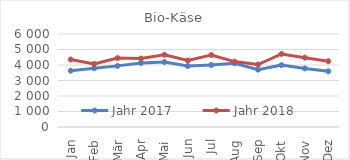
| Category | Jahr 2017 | Jahr 2018 |
|---|---|---|
| Jan | 3630.192 | 4353.001 |
| Feb | 3791.781 | 4066.819 |
| Mär | 3944.033 | 4446.267 |
| Apr | 4130.856 | 4415.269 |
| Mai | 4192.518 | 4659.821 |
| Jun | 3932.093 | 4285.81 |
| Jul | 3999.606 | 4645.796 |
| Aug | 4110.773 | 4219.614 |
| Sep | 3699.638 | 4031.524 |
| Okt | 3991.875 | 4713.261 |
| Nov | 3778.407 | 4472.453 |
| Dez | 3597.548 | 4244.969 |